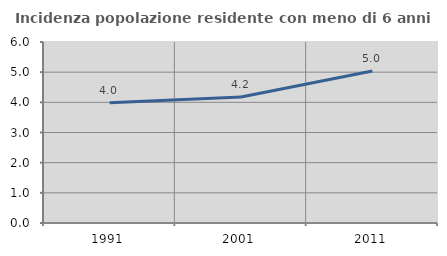
| Category | Incidenza popolazione residente con meno di 6 anni |
|---|---|
| 1991.0 | 3.984 |
| 2001.0 | 4.175 |
| 2011.0 | 5.039 |